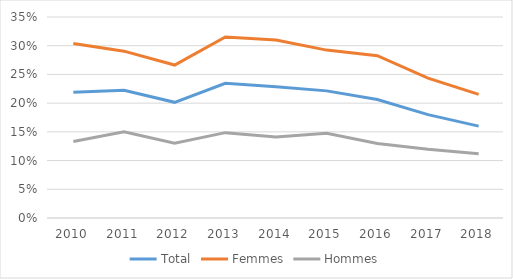
| Category | Total | Femmes | Hommes |
|---|---|---|---|
| 2010.0 | 0.219 | 0.304 | 0.133 |
| 2011.0 | 0.222 | 0.29 | 0.15 |
| 2012.0 | 0.201 | 0.266 | 0.13 |
| 2013.0 | 0.235 | 0.315 | 0.149 |
| 2014.0 | 0.229 | 0.31 | 0.141 |
| 2015.0 | 0.221 | 0.292 | 0.147 |
| 2016.0 | 0.206 | 0.283 | 0.13 |
| 2017.0 | 0.18 | 0.244 | 0.12 |
| 2018.0 | 0.16 | 0.215 | 0.112 |